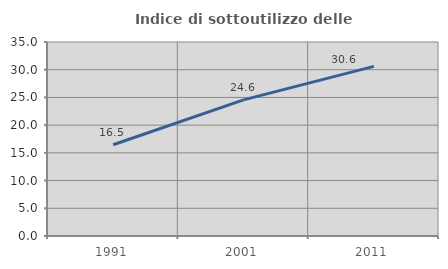
| Category | Indice di sottoutilizzo delle abitazioni  |
|---|---|
| 1991.0 | 16.465 |
| 2001.0 | 24.559 |
| 2011.0 | 30.602 |